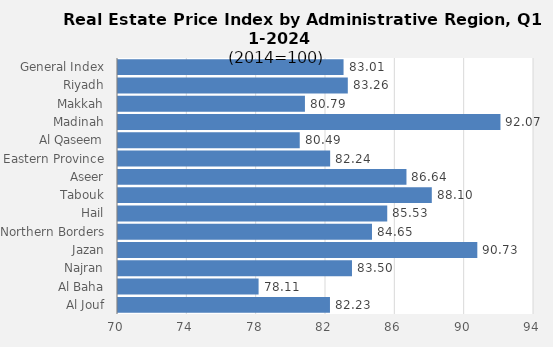
| Category | 2024 |
|---|---|
| General Index | 83.013 |
| Riyadh | 83.258 |
| Makkah | 80.785 |
| Madinah | 92.065 |
| Al Qaseem | 80.485 |
| Eastern Province | 82.24 |
| Aseer | 86.642 |
| Tabouk | 88.104 |
| Hail | 85.533 |
| Northern Borders | 84.653 |
| Jazan | 90.73 |
| Najran | 83.499 |
| Al Baha | 78.111 |
| Al Jouf | 82.229 |